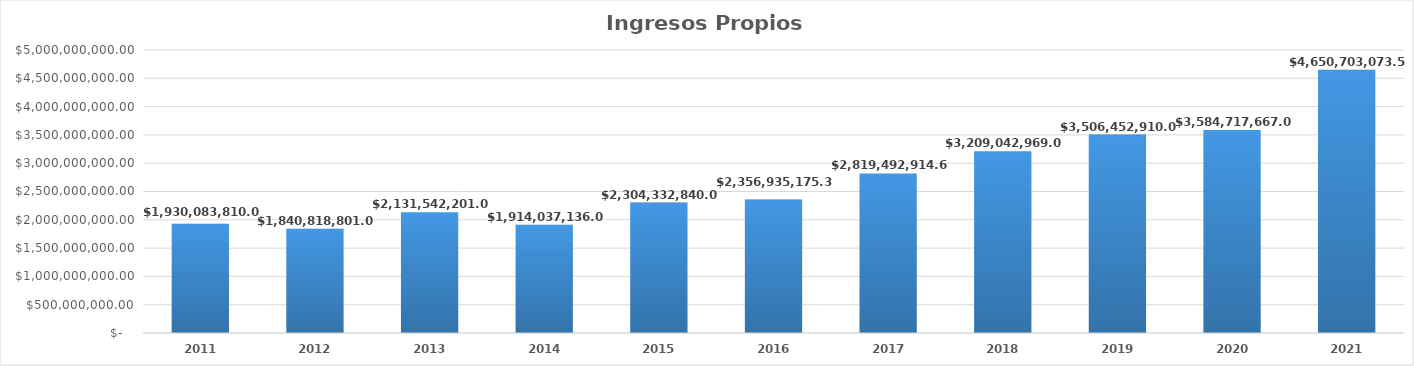
| Category | Ingresos Propios (Total) |
|---|---|
| 2011.0 | 1930083810 |
| 2012.0 | 1840818801 |
| 2013.0 | 2131542201 |
| 2014.0 | 1914037136 |
| 2015.0 | 2304332840 |
| 2016.0 | 2356935175.31 |
| 2017.0 | 2819492914.62 |
| 2018.0 | 3209042969 |
| 2019.0 | 3506452910 |
| 2020.0 | 3584717667 |
| 2021.0 | 4650703073.53 |